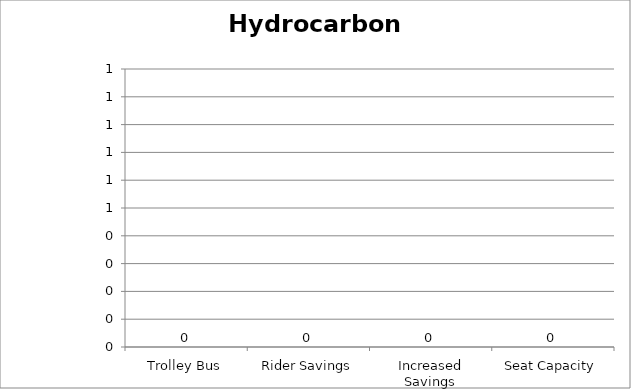
| Category | Hydrocarbons |
|---|---|
| Trolley Bus | 0 |
| Rider Savings | 0 |
| Increased Savings | 0 |
| Seat Capacity | 0 |